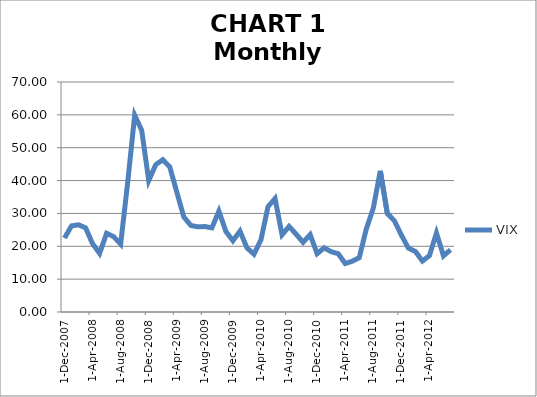
| Category | VIX |
|---|---|
| 2007-12-31 | 22.5 |
| 2008-01-31 | 26.2 |
| 2008-02-29 | 26.54 |
| 2008-03-31 | 25.61 |
| 2008-04-30 | 20.79 |
| 2008-05-30 | 17.83 |
| 2008-06-30 | 23.95 |
| 2008-07-31 | 22.94 |
| 2008-08-29 | 20.65 |
| 2008-09-30 | 39.39 |
| 2008-10-31 | 59.89 |
| 2008-11-28 | 55.28 |
| 2008-12-31 | 40 |
| 2009-01-30 | 44.84 |
| 2009-02-27 | 46.35 |
| 2009-03-31 | 44.14 |
| 2009-04-30 | 36.5 |
| 2009-05-29 | 28.92 |
| 2009-06-30 | 26.35 |
| 2009-07-31 | 25.92 |
| 2009-08-31 | 26.01 |
| 2009-09-30 | 25.61 |
| 2009-10-30 | 30.69 |
| 2009-11-30 | 24.51 |
| 2009-12-31 | 21.68 |
| 2010-01-29 | 24.62 |
| 2010-02-26 | 19.5 |
| 2010-03-31 | 17.59 |
| 2010-04-30 | 22.05 |
| 2010-05-31 | 32.07 |
| 2010-06-30 | 34.54 |
| 2010-07-30 | 23.5 |
| 2010-08-31 | 26.05 |
| 2010-09-30 | 23.7 |
| 2010-10-29 | 21.2 |
| 2010-11-30 | 23.54 |
| 2010-12-31 | 17.75 |
| 2011-01-31 | 19.53 |
| 2011-02-28 | 18.35 |
| 2011-03-31 | 17.74 |
| 2011-04-29 | 14.75 |
| 2011-05-31 | 15.45 |
| 2011-06-30 | 16.52 |
| 2011-07-29 | 25.25 |
| 2011-08-31 | 31.62 |
| 2011-09-30 | 42.96 |
| 2011-10-31 | 29.96 |
| 2011-11-30 | 27.8 |
| 2011-12-30 | 23.4 |
| 2012-01-31 | 19.44 |
| 2012-02-29 | 18.43 |
| 2012-03-30 | 15.5 |
| 2012-04-30 | 17.15 |
| 2012-05-31 | 24.06 |
| 2012-06-29 | 17.08 |
| 2012-07-31 | 18.93 |